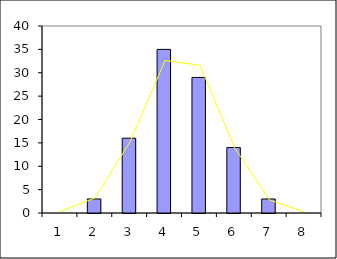
| Category | częstość
rzeczywista |
|---|---|
| 0 | 0 |
| 1 | 3 |
| 2 | 16 |
| 3 | 35 |
| 4 | 29 |
| 5 | 14 |
| 6 | 3 |
| 7 | 0 |